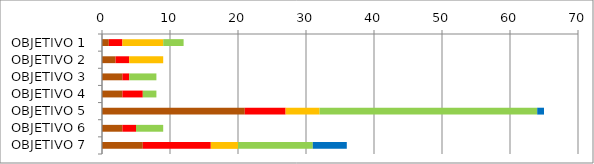
| Category | Series 0 | Series 1 | Series 2 | Series 3 | Series 4 | Series 5 |
|---|---|---|---|---|---|---|
| OBJETIVO 1 | 1 | 0 | 2 | 6 | 3 | 0 |
| OBJETIVO 2 | 2 | 0 | 2 | 5 | 0 | 0 |
| OBJETIVO 3 | 3 | 0 | 1 | 0 | 4 | 0 |
| OBJETIVO 4 | 3 | 0 | 3 | 0 | 2 | 0 |
| OBJETIVO 5 | 21 | 0 | 6 | 5 | 32 | 1 |
| OBJETIVO 6 | 3 | 0 | 2 | 0 | 4 | 0 |
| OBJETIVO 7 | 6 | 0 | 10 | 4 | 11 | 5 |